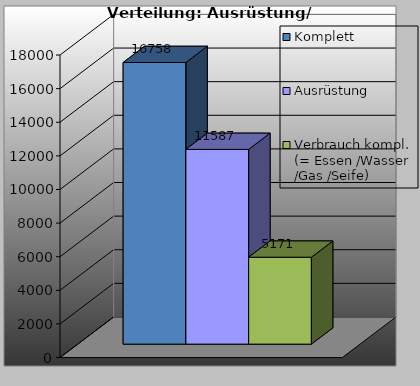
| Category | Komplett | Ausrüstung | Verbrauch kompl.   (= Essen /Wasser /Gas /Seife) |
|---|---|---|---|
| 0 | 16758 | 11587 | 5171 |